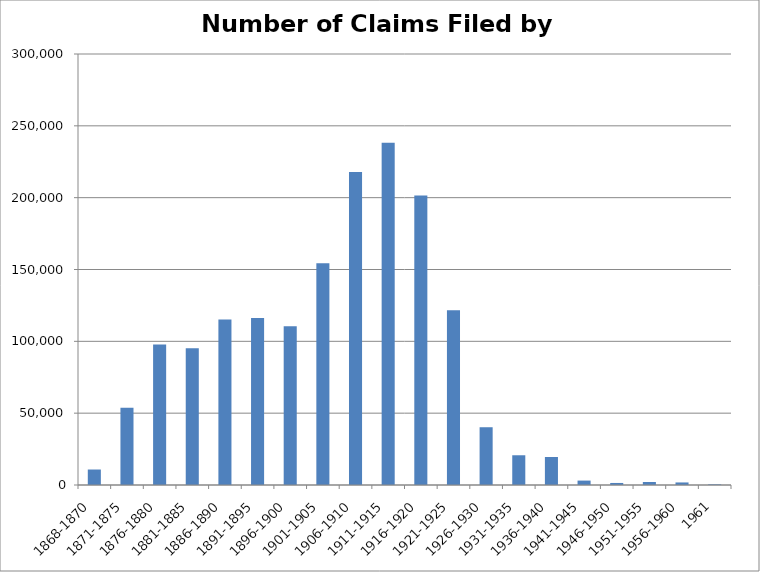
| Category | # |
|---|---|
| 1868-1870 | 10778 |
| 1871-1875 | 53737 |
| 1876-1880 | 97722 |
| 1881-1885 | 95158 |
| 1886-1890 | 115264 |
| 1891-1895 | 116158 |
| 1896-1900 | 110585 |
| 1901-1905 | 154272 |
| 1906-1910 | 217820 |
| 1911-1915 | 238228 |
| 1916-1920 | 201482 |
| 1921-1925 | 121686 |
| 1926-1930 | 40210 |
| 1931-1935 | 20701 |
| 1936-1940 | 19510 |
| 1941-1945 | 3074 |
| 1946-1950 | 1418 |
| 1951-1955 | 2080 |
| 1956-1960 | 1776 |
| 1961 | 438 |